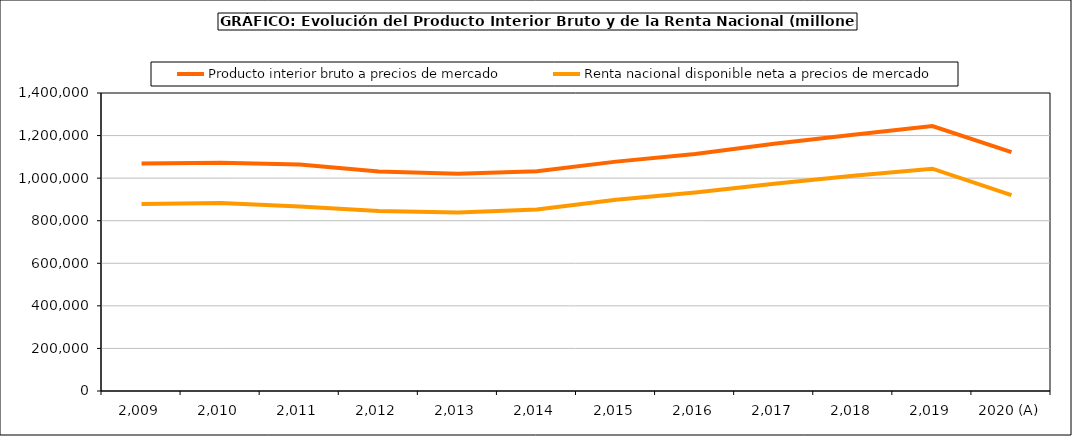
| Category | Producto interior bruto a precios de mercado | Renta nacional disponible neta a precios de mercado |
|---|---|---|
| 2,009 | 1069323 | 878214 |
| 2,010 | 1072709 | 882934 |
| 2,011 | 1063763 | 867238 |
| 2,012 | 1031099 | 845973 |
| 2,013 | 1020348 | 838494 |
| 2,014 | 1032158 | 853217 |
| 2,015 | 1077590 | 897955 |
| 2,016 | 1113840 | 932147 |
| 2,017 | 1161867 | 974106 |
| 2,018 | 1204241 | 1010794 |
| 2,019 | 1244375 | 1044250 |
| 2020 (A) | 1121948 | 920062 |